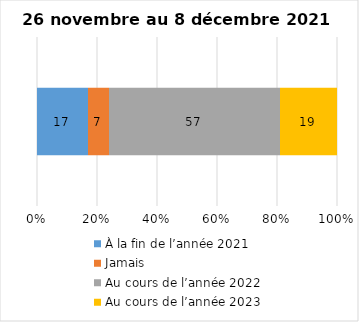
| Category | À la fin de l’année 2021 | Jamais | Au cours de l’année 2022 | Au cours de l’année 2023 |
|---|---|---|---|---|
| 0 | 17 | 7 | 57 | 19 |